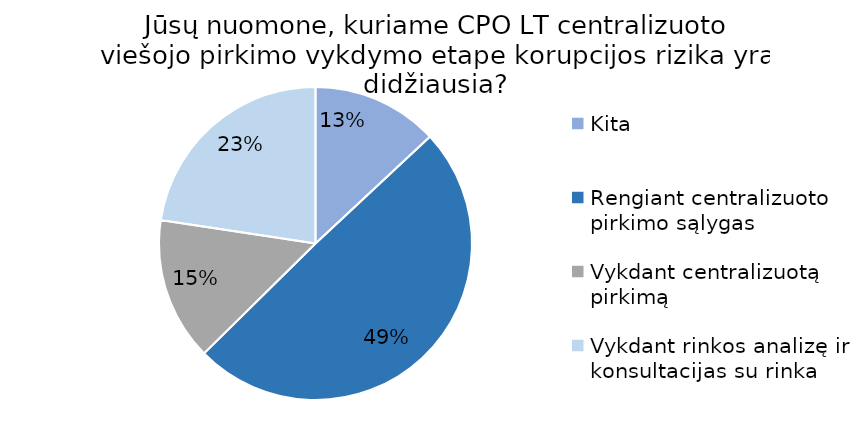
| Category | Series 0 |
|---|---|
| Kita | 15 |
| Rengiant centralizuoto pirkimo sąlygas | 57 |
| Vykdant centralizuotą pirkimą | 17 |
| Vykdant rinkos analizę ir konsultacijas su rinka | 26 |